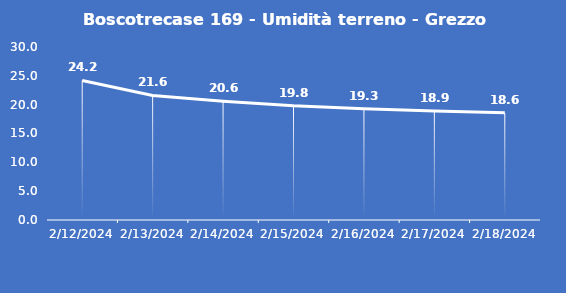
| Category | Boscotrecase 169 - Umidità terreno - Grezzo (%VWC) |
|---|---|
| 2/12/24 | 24.2 |
| 2/13/24 | 21.6 |
| 2/14/24 | 20.6 |
| 2/15/24 | 19.8 |
| 2/16/24 | 19.3 |
| 2/17/24 | 18.9 |
| 2/18/24 | 18.6 |